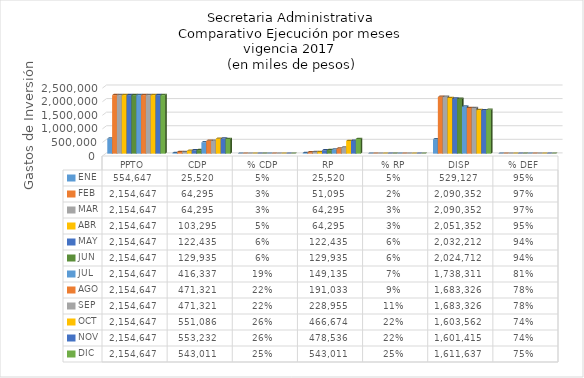
| Category | ENE | FEB | MAR | ABR | MAY  | JUN  | JUL | AGO | SEP | OCT | NOV | DIC |
|---|---|---|---|---|---|---|---|---|---|---|---|---|
| PPTO | 554647.401 | 2154647.401 | 2154647.401 | 2154647.401 | 2154647.401 | 2154647.01 | 2154647.401 | 2154647.401 | 2154647.401 | 2154647.401 | 2154647.401 | 2154647.401 |
| CDP | 25520 | 64295 | 64295 | 103295 | 122435 | 129935 | 416336.801 | 471321.142 | 471321.142 | 551085.754 | 553232.42 | 543010.51 |
| % CDP | 0.046 | 0.03 | 0.03 | 0.048 | 0.057 | 0.06 | 0.193 | 0.219 | 0.219 | 0.256 | 0.257 | 0.252 |
| RP | 25520 | 51095 | 64295 | 64295 | 122435 | 129935 | 149135 | 191033.333 | 228954.864 | 466673.898 | 478535.51 | 543010.51 |
| % RP | 0.046 | 0.024 | 0.03 | 0.03 | 0.057 | 0.06 | 0.069 | 0.089 | 0.106 | 0.217 | 0.222 | 0.252 |
| DISP | 529127.401 | 2090352.401 | 2090352.401 | 2051352.401 | 2032212.401 | 2024712.401 | 1738310.6 | 1683326.259 | 1683326.259 | 1603561.647 | 1601414.981 | 1611636.891 |
| % DEF | 0.954 | 0.97 | 0.97 | 0.952 | 0.943 | 0.94 | 0.807 | 0.781 | 0.781 | 0.744 | 0.743 | 0.748 |